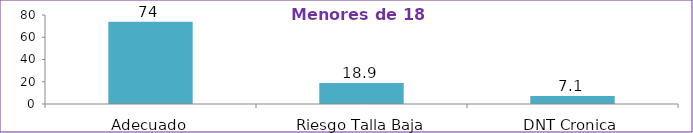
| Category | Series 0 |
|---|---|
| Adecuado | 74 |
| Riesgo Talla Baja | 18.9 |
| DNT Cronica | 7.1 |